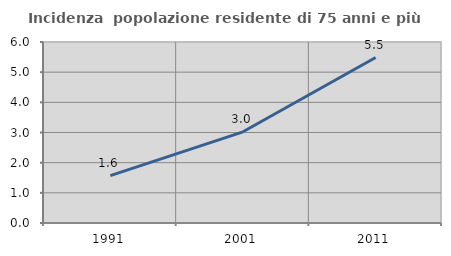
| Category | Incidenza  popolazione residente di 75 anni e più |
|---|---|
| 1991.0 | 1.572 |
| 2001.0 | 3.023 |
| 2011.0 | 5.484 |